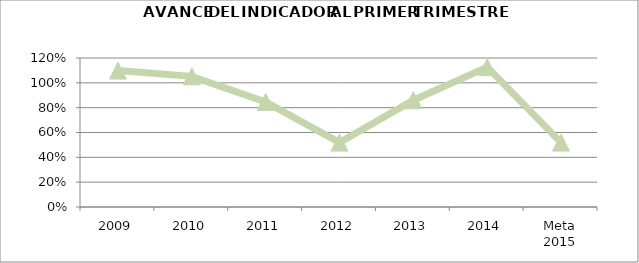
| Category | Series 2 |
|---|---|
| 2009 | 1.099 |
| 2010 | 1.052 |
| 2011 | 0.846 |
| 2012 | 0.519 |
| 2013 | 0.86 |
| 2014 | 1.126 |
| Meta 2015 | 0.519 |